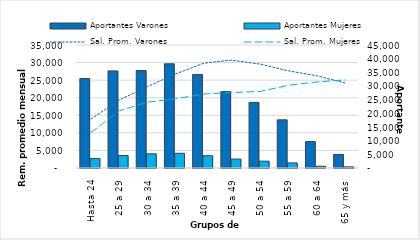
| Category | Aportantes Varones | Aportantes Mujeres |
|---|---|---|
| 0 | 32704 | 3499 |
| 1 | 35531 | 4562 |
| 2 | 35660 | 5193 |
| 3 | 38122 | 5379 |
| 4 | 34175 | 4494 |
| 5 | 27948 | 3274 |
| 6 | 24008 | 2501 |
| 7 | 17624 | 1859 |
| 8 | 9692 | 640 |
| 9 | 4938 | 422 |